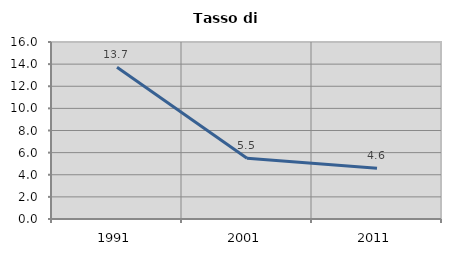
| Category | Tasso di disoccupazione   |
|---|---|
| 1991.0 | 13.714 |
| 2001.0 | 5.5 |
| 2011.0 | 4.587 |